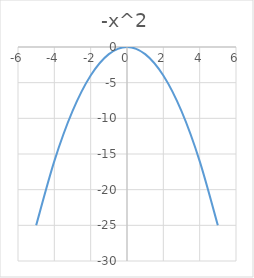
| Category | -x^2 |
|---|---|
| -5.0 | -25 |
| -4.0 | -16 |
| -3.0 | -9 |
| -2.0 | -4 |
| -1.0 | -1 |
| 0.0 | 0 |
| 1.0 | -1 |
| 2.0 | -4 |
| 3.0 | -9 |
| 4.0 | -16 |
| 5.0 | -25 |